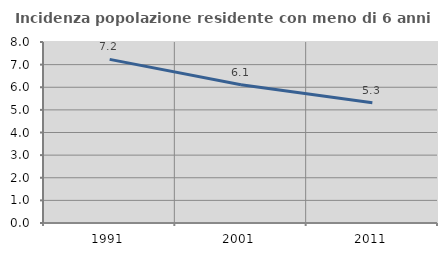
| Category | Incidenza popolazione residente con meno di 6 anni |
|---|---|
| 1991.0 | 7.231 |
| 2001.0 | 6.11 |
| 2011.0 | 5.314 |